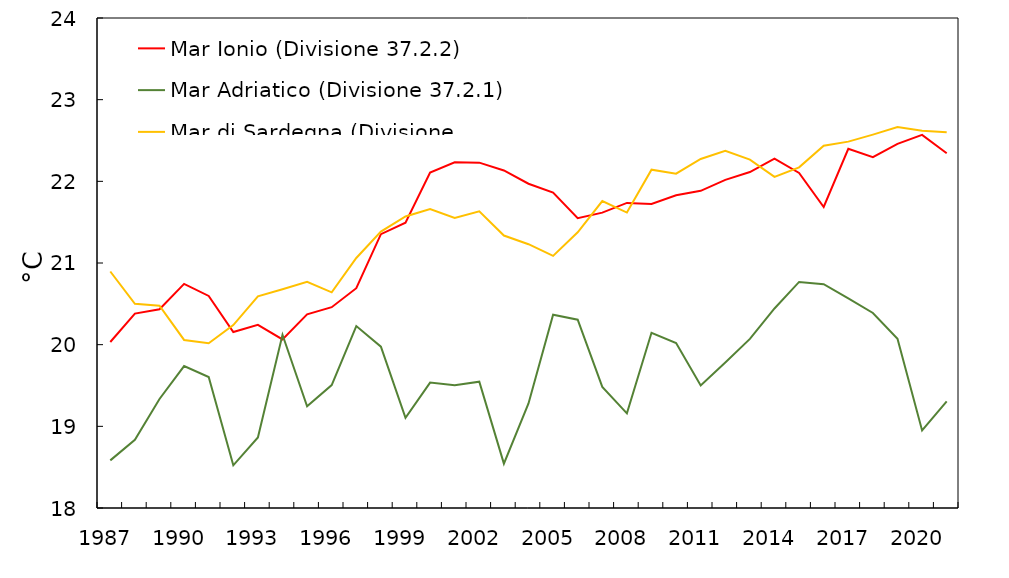
| Category | Mar Ionio (Divisione 37.2.2) | Mar Adriatico (Divisione 37.2.1) | Mar di Sardegna (Divisione 37.1.3) |
|---|---|---|---|
| 1987.0 | 20.033 | 18.583 | 20.896 |
| 1988.0 | 20.38 | 18.835 | 20.501 |
| 1989.0 | 20.434 | 19.335 | 20.477 |
| 1990.0 | 20.744 | 19.738 | 20.058 |
| 1991.0 | 20.596 | 19.603 | 20.017 |
| 1992.0 | 20.155 | 18.523 | 20.24 |
| 1993.0 | 20.243 | 18.864 | 20.593 |
| 1994.0 | 20.064 | 20.122 | 20.679 |
| 1995.0 | 20.372 | 19.245 | 20.769 |
| 1996.0 | 20.459 | 19.505 | 20.641 |
| 1997.0 | 20.691 | 20.228 | 21.061 |
| 1998.0 | 21.353 | 19.976 | 21.385 |
| 1999.0 | 21.494 | 19.105 | 21.57 |
| 2000.0 | 22.107 | 19.535 | 21.662 |
| 2001.0 | 22.234 | 19.504 | 21.552 |
| 2002.0 | 22.229 | 19.547 | 21.633 |
| 2003.0 | 22.133 | 18.543 | 21.336 |
| 2004.0 | 21.971 | 19.28 | 21.23 |
| 2005.0 | 21.862 | 20.367 | 21.087 |
| 2006.0 | 21.548 | 20.305 | 21.376 |
| 2007.0 | 21.616 | 19.483 | 21.758 |
| 2008.0 | 21.736 | 19.159 | 21.618 |
| 2009.0 | 21.723 | 20.145 | 22.143 |
| 2010.0 | 21.829 | 20.02 | 22.094 |
| 2011.0 | 21.884 | 19.5 | 22.274 |
| 2012.0 | 22.018 | 19.782 | 22.374 |
| 2013.0 | 22.114 | 20.071 | 22.266 |
| 2014.0 | 22.278 | 20.443 | 22.055 |
| 2015.0 | 22.103 | 20.768 | 22.171 |
| 2016.0 | 21.686 | 20.741 | 22.435 |
| 2017.0 | 22.398 | 20.567 | 22.486 |
| 2018.0 | 22.296 | 20.388 | 22.572 |
| 2019.0 | 22.459 | 20.072 | 22.664 |
| 2020.0 | 22.569 | 18.95 | 22.618 |
| 2021.0 | 22.343 | 19.305 | 22.6 |